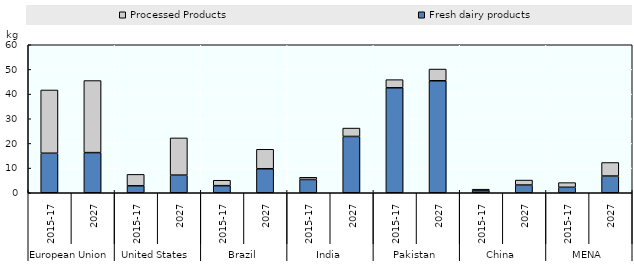
| Category | Fresh dairy products | Processed Products |
|---|---|---|
| 0 | 16.02 | 25.648 |
| 1 | 16.277 | 29.211 |
| 2 | 2.812 | 4.639 |
| 3 | 7.148 | 15.086 |
| 4 | 2.872 | 2.208 |
| 5 | 9.726 | 7.903 |
| 6 | 5.381 | 0.886 |
| 7 | 22.828 | 3.397 |
| 8 | 42.552 | 3.304 |
| 9 | 45.399 | 4.752 |
| 10 | 0.868 | 0.578 |
| 11 | 3.132 | 2.013 |
| 12 | 2.212 | 1.903 |
| 13 | 6.774 | 5.494 |